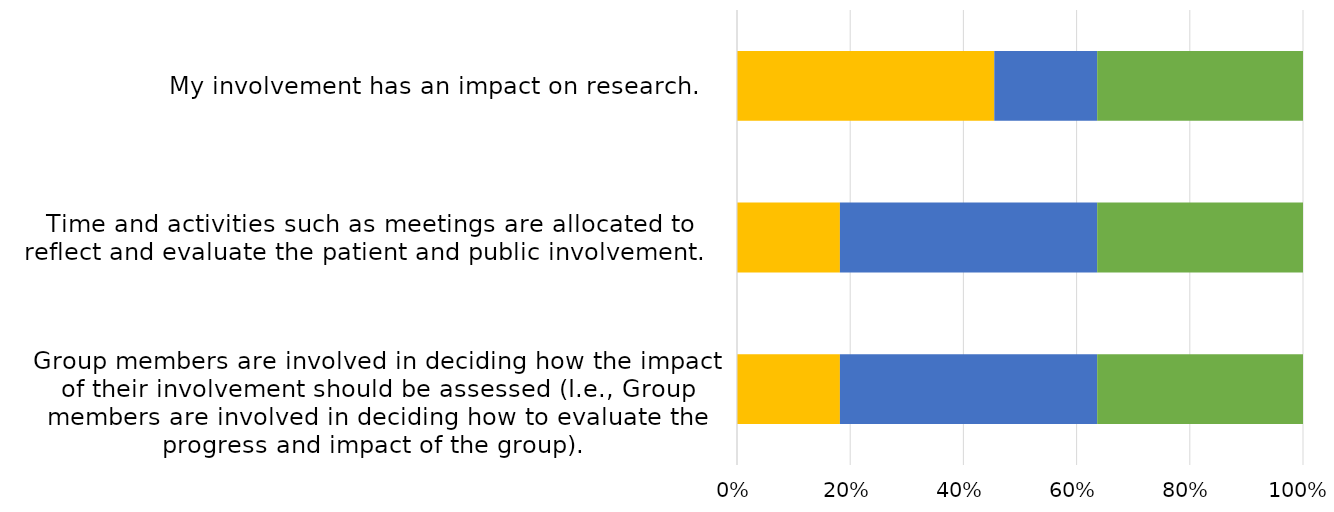
| Category | Strongly Disagree 
 | Disagree
 | Neither agree nor disagree
 | Agree
 | Strongly agree
 |
|---|---|---|---|---|---|
| 
Group members are involved in deciding how the impact of their involvement should be assessed (I.e., Group members are involved in deciding how to evaluate the progress and impact of the group). 
 | 0 | 0 | 0.182 | 0.455 | 0.364 |
| Time and activities such as meetings are allocated to reflect and evaluate the patient and public involvement. 
 | 0 | 0 | 0.182 | 0.455 | 0.364 |
| My involvement has an impact on research. 
 | 0 | 0 | 0.455 | 0.182 | 0.364 |